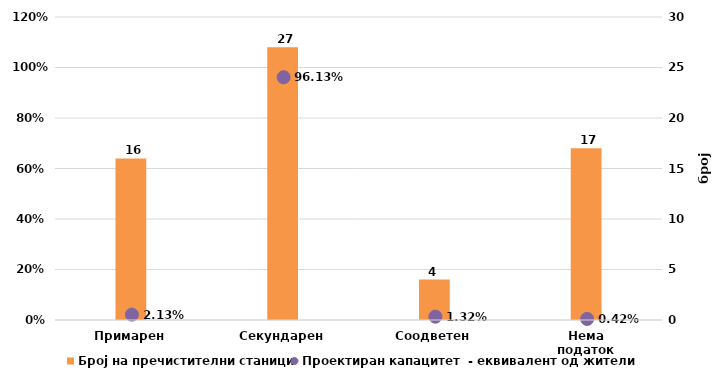
| Category | Број на пречистителни станици |
|---|---|
| Примарен | 16 |
| Секундарен | 27 |
| Соодветен | 4 |
| Нема податок | 17 |